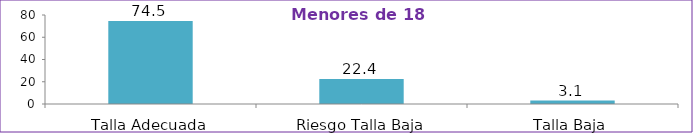
| Category | Series 0 |
|---|---|
| Talla Adecuada | 74.5 |
| Riesgo Talla Baja | 22.4 |
| Talla Baja | 3.1 |